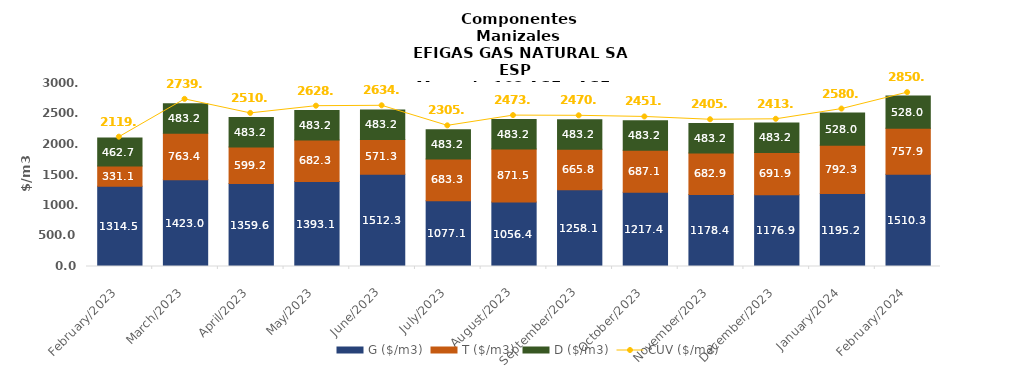
| Category | G ($/m3) | T ($/m3) | D ($/m3) |
|---|---|---|---|
| 2023-02-01 | 1314.49 | 331.09 | 462.69 |
| 2023-03-01 | 1422.95 | 763.36 | 483.205 |
| 2023-04-01 | 1359.57 | 599.24 | 483.2 |
| 2023-05-01 | 1393.1 | 682.25 | 483.2 |
| 2023-06-01 | 1512.34 | 571.34 | 483.2 |
| 2023-07-01 | 1077.14 | 683.33 | 483.2 |
| 2023-08-01 | 1056.36 | 871.51 | 483.2 |
| 2023-09-01 | 1258.12 | 665.75 | 483.2 |
| 2023-10-01 | 1217.367 | 687.084 | 483.205 |
| 2023-11-01 | 1178.421 | 682.88 | 483.205 |
| 2023-12-01 | 1176.905 | 691.935 | 483.205 |
| 2024-01-01 | 1195.188 | 792.332 | 528.046 |
| 2024-02-01 | 1510.327 | 757.913 | 528.046 |